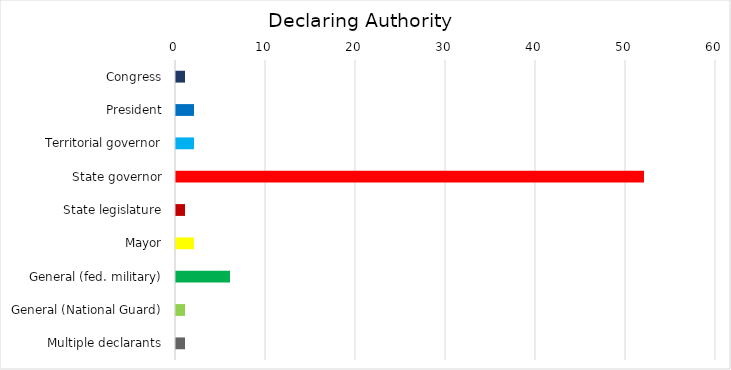
| Category | Series 0 |
|---|---|
| Congress | 1 |
| President | 2 |
| Territorial governor | 2 |
| State governor | 52 |
| State legislature | 1 |
| Mayor | 2 |
| General (fed. military) | 6 |
| General (National Guard) | 1 |
| Multiple declarants | 1 |